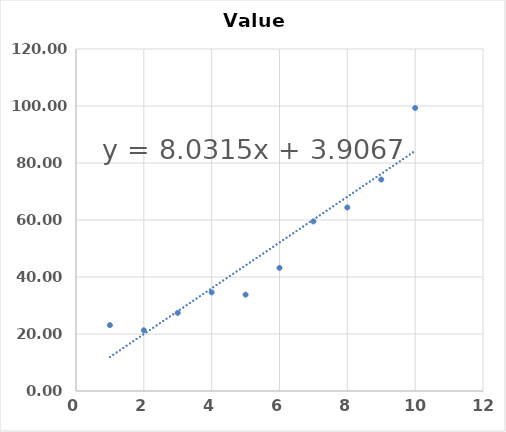
| Category | Series 0 |
|---|---|
| 1.0 | 23.1 |
| 2.0 | 21.3 |
| 3.0 | 27.4 |
| 4.0 | 34.6 |
| 5.0 | 33.8 |
| 6.0 | 43.2 |
| 7.0 | 59.5 |
| 8.0 | 64.4 |
| 9.0 | 74.2 |
| 10.0 | 99.3 |